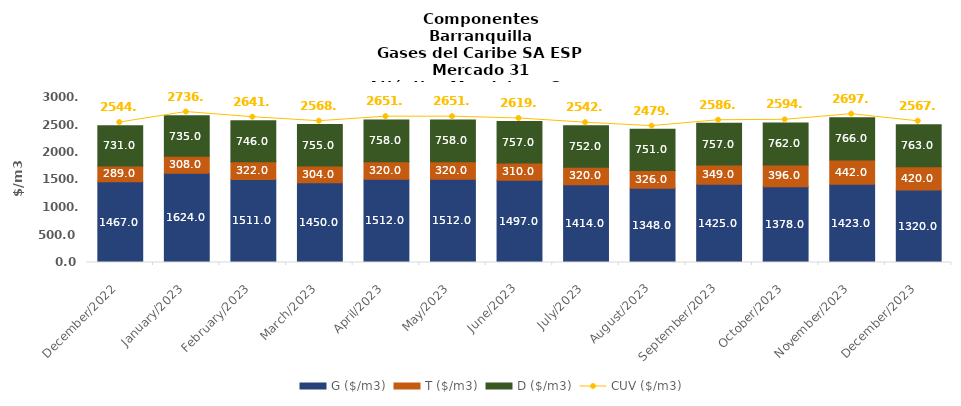
| Category | G ($/m3) | T ($/m3) | D ($/m3) |
|---|---|---|---|
| 2022-12-01 | 1467 | 289 | 731 |
| 2023-01-01 | 1624 | 308 | 735 |
| 2023-02-01 | 1511 | 322 | 746 |
| 2023-03-01 | 1450 | 304 | 755 |
| 2023-04-01 | 1512 | 320 | 758 |
| 2023-05-01 | 1512 | 320 | 758 |
| 2023-06-01 | 1497 | 310 | 757 |
| 2023-07-01 | 1414 | 320 | 752 |
| 2023-08-01 | 1348 | 326 | 751 |
| 2023-09-01 | 1425 | 349 | 757 |
| 2023-10-01 | 1378 | 396 | 762 |
| 2023-11-01 | 1423 | 442 | 766 |
| 2023-12-01 | 1320 | 420 | 763 |